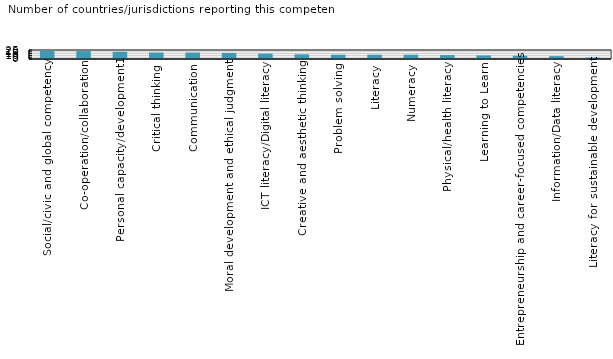
| Category | Countries/jurisdictions  citing this competency (37 in total) |
|---|---|
| Social/civic and global competency | 23 |
| Co-operation/collaboration | 22 |
| Personal capacity/development1 | 20 |
| Critical thinking | 18 |
| Communication | 18 |
| Moral development and ethical judgment  | 17 |
| ICT literacy/Digital literacy | 15 |
| Creative and aesthetic thinking | 13 |
| Problem solving | 12 |
| Literacy | 12 |
| Numeracy | 12 |
| Physical/health literacy | 11 |
| Learning to Learn | 10 |
| Entrepreneurship and career-focused competencies | 9 |
| Information/Data literacy | 8 |
| Literacy for sustainable development | 4 |